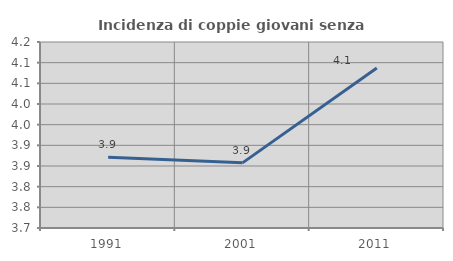
| Category | Incidenza di coppie giovani senza figli |
|---|---|
| 1991.0 | 3.871 |
| 2001.0 | 3.858 |
| 2011.0 | 4.087 |